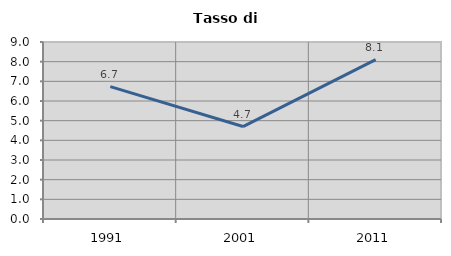
| Category | Tasso di disoccupazione   |
|---|---|
| 1991.0 | 6.728 |
| 2001.0 | 4.7 |
| 2011.0 | 8.103 |